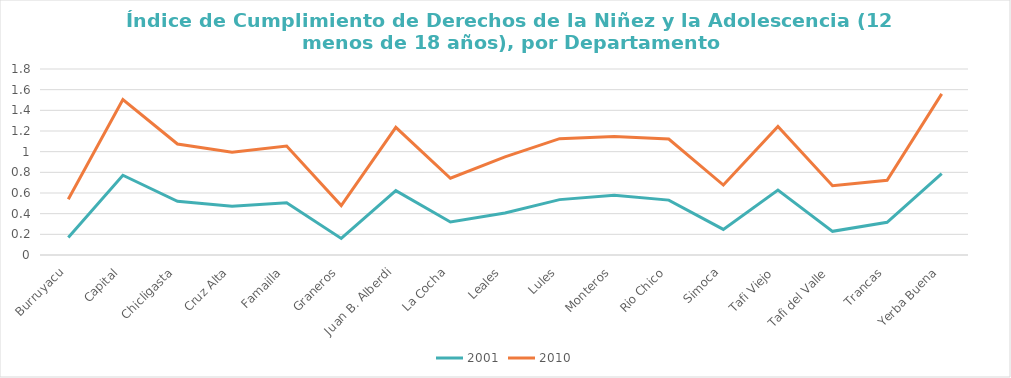
| Category | 2001 | 2010 |
|---|---|---|
| Burruyacu | 0.169 | 0.371 |
| Capital | 0.772 | 0.732 |
| Chicligasta | 0.52 | 0.554 |
| Cruz Alta | 0.472 | 0.523 |
| Famailla | 0.506 | 0.548 |
| Graneros | 0.16 | 0.319 |
| Juan B. Alberdi | 0.623 | 0.612 |
| La Cocha | 0.319 | 0.424 |
| Leales | 0.407 | 0.542 |
| Lules | 0.536 | 0.59 |
| Monteros | 0.578 | 0.568 |
| Rio Chico | 0.531 | 0.591 |
| Simoca | 0.248 | 0.429 |
| Tafi Viejo | 0.628 | 0.616 |
| Tafi del Valle | 0.229 | 0.442 |
| Trancas | 0.316 | 0.407 |
| Yerba Buena | 0.788 | 0.771 |